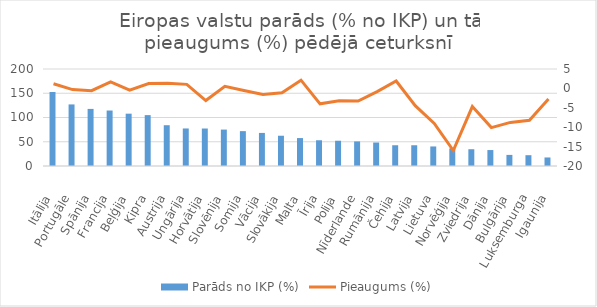
| Category | Parāds no IKP (%) |
|---|---|
| Itālija | 152.6 |
| Portugāle | 127 |
| Spānija | 117.7 |
| Francija | 114.4 |
|  Beļģija | 107.9 |
| Kipra | 104.9 |
|  Austrija | 84.1 |
| Ungārija | 77.4 |
| Horvātija | 77.3 |
| Slovēnija | 75.1 |
| Somija | 71.9 |
| Vācija | 68.2 |
| Slovākija | 62.4 |
| Malta | 57.6 |
| Īrija | 53.1 |
| Polija | 52.1 |
| Nīderlande | 50.7 |
| Rumānija | 48.4 |
|  Čehija | 42.8 |
| Latvija | 42.8 |
| Lietuva | 40.3 |
| Norvēģija | 36.2 |
| Zviedrija | 34.6 |
| Dānija | 32.9 |
|  Bulgārija | 22.9 |
| Luksemburga | 22.3 |
| Igaunija | 17.6 |